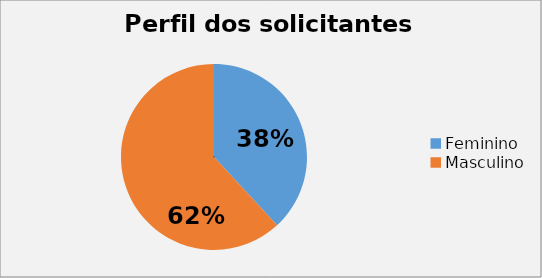
| Category | Series 0 |
|---|---|
| Feminino  | 0.381 |
| Masculino  | 0.619 |